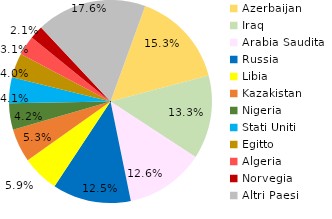
| Category | Series 0 |
|---|---|
| Azerbaijan | 10010.989 |
| Iraq | 8718.607 |
| Arabia Saudita | 8245.177 |
| Russia | 8184.259 |
| Libia | 3855.678 |
| Kazakistan | 3477.901 |
| Nigeria | 2759.619 |
| Stati Uniti | 2684.006 |
| Egitto | 2575.362 |
| Algeria | 2035.854 |
| Norvegia | 1394.548 |
| Altri Paesi | 11477.015 |